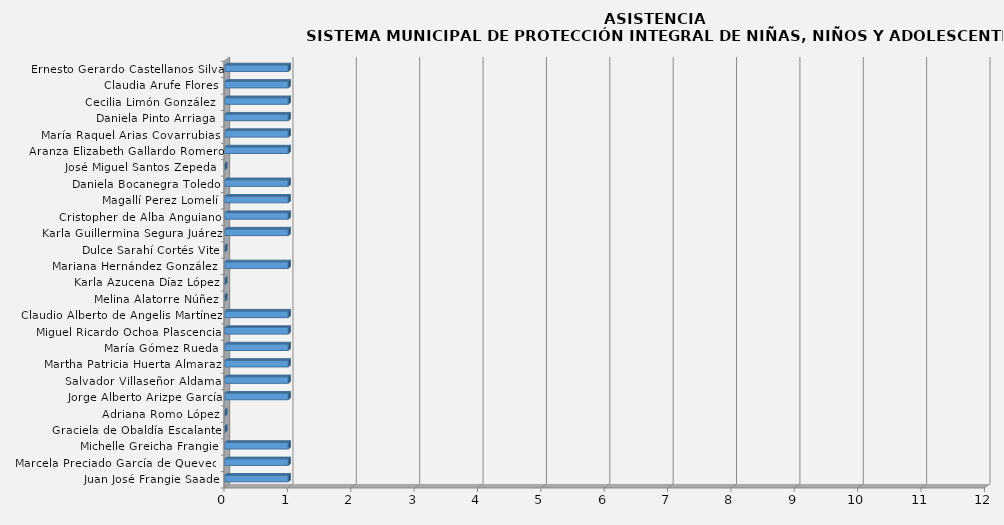
| Category | Series 0 |
|---|---|
| Juan José Frangie Saade | 1 |
| Marcela Preciado García de Quevedo | 1 |
| Michelle Greicha Frangie | 1 |
| Graciela de Obaldía Escalante | 0 |
| Adriana Romo López | 0 |
| Jorge Alberto Arizpe García | 1 |
| Salvador Villaseñor Aldama | 1 |
| Martha Patricia Huerta Almaraz | 1 |
| María Gómez Rueda | 1 |
| Miguel Ricardo Ochoa Plascencia | 1 |
| Claudio Alberto de Angelis Martínez | 1 |
| Melina Alatorre Núñez | 0 |
| Karla Azucena Díaz López | 0 |
| Mariana Hernández González  | 1 |
| Dulce Sarahí Cortés Vite | 0 |
| Karla Guillermina Segura Juárez | 1 |
| Cristopher de Alba Anguiano | 1 |
| Magallí Perez Lomelí | 1 |
| Daniela Bocanegra Toledo | 1 |
| José Miguel Santos Zepeda  | 0 |
| Aranza Elizabeth Gallardo Romero | 1 |
| María Raquel Arias Covarrubias  | 1 |
| Daniela Pinto Arriaga  | 1 |
| Cecilia Limón González  | 1 |
| Claudia Arufe Flores | 1 |
| Ernesto Gerardo Castellanos Silva | 1 |